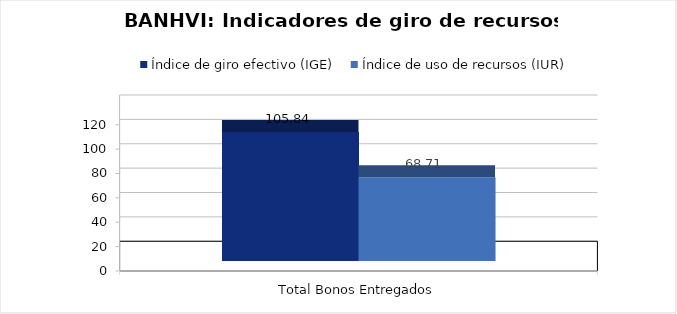
| Category | Índice de giro efectivo (IGE) | Índice de uso de recursos (IUR)  |
|---|---|---|
| Total Bonos Entregados | 105.837 | 68.715 |